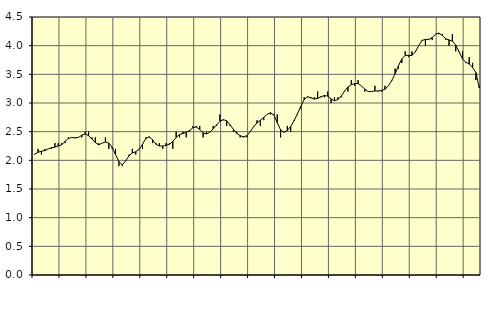
| Category | Piggar | Series 1 |
|---|---|---|
| nan | 2.1 | 2.11 |
| 87.0 | 2.2 | 2.14 |
| 87.0 | 2.1 | 2.16 |
| 87.0 | 2.2 | 2.17 |
| nan | 2.2 | 2.2 |
| 88.0 | 2.2 | 2.22 |
| 88.0 | 2.3 | 2.23 |
| 88.0 | 2.3 | 2.25 |
| nan | 2.3 | 2.27 |
| 89.0 | 2.3 | 2.33 |
| 89.0 | 2.4 | 2.38 |
| 89.0 | 2.4 | 2.4 |
| nan | 2.4 | 2.39 |
| 90.0 | 2.4 | 2.4 |
| 90.0 | 2.4 | 2.44 |
| 90.0 | 2.5 | 2.46 |
| nan | 2.5 | 2.43 |
| 91.0 | 2.4 | 2.37 |
| 91.0 | 2.4 | 2.31 |
| 91.0 | 2.3 | 2.27 |
| nan | 2.3 | 2.3 |
| 92.0 | 2.4 | 2.32 |
| 92.0 | 2.2 | 2.3 |
| 92.0 | 2.2 | 2.23 |
| nan | 2.2 | 2.1 |
| 93.0 | 1.9 | 1.98 |
| 93.0 | 1.9 | 1.92 |
| 93.0 | 2 | 1.99 |
| nan | 2.1 | 2.08 |
| 94.0 | 2.2 | 2.13 |
| 94.0 | 2.1 | 2.15 |
| 94.0 | 2.2 | 2.19 |
| nan | 2.2 | 2.28 |
| 95.0 | 2.4 | 2.38 |
| 95.0 | 2.4 | 2.41 |
| 95.0 | 2.3 | 2.36 |
| nan | 2.3 | 2.28 |
| 96.0 | 2.3 | 2.25 |
| 96.0 | 2.2 | 2.25 |
| 96.0 | 2.3 | 2.26 |
| nan | 2.3 | 2.28 |
| 97.0 | 2.2 | 2.33 |
| 97.0 | 2.5 | 2.4 |
| 97.0 | 2.4 | 2.45 |
| nan | 2.5 | 2.47 |
| 98.0 | 2.4 | 2.49 |
| 98.0 | 2.5 | 2.52 |
| 98.0 | 2.6 | 2.57 |
| nan | 2.6 | 2.58 |
| 99.0 | 2.6 | 2.54 |
| 99.0 | 2.4 | 2.48 |
| 99.0 | 2.5 | 2.46 |
| nan | 2.5 | 2.49 |
| 0.0 | 2.6 | 2.55 |
| 0.0 | 2.6 | 2.62 |
| 0.0 | 2.8 | 2.68 |
| nan | 2.7 | 2.71 |
| 1.0 | 2.6 | 2.69 |
| 1.0 | 2.6 | 2.62 |
| 1.0 | 2.5 | 2.54 |
| nan | 2.5 | 2.47 |
| 2.0 | 2.4 | 2.43 |
| 2.0 | 2.4 | 2.41 |
| 2.0 | 2.4 | 2.43 |
| nan | 2.5 | 2.5 |
| 3.0 | 2.6 | 2.59 |
| 3.0 | 2.7 | 2.65 |
| 3.0 | 2.6 | 2.7 |
| nan | 2.7 | 2.75 |
| 4.0 | 2.8 | 2.8 |
| 4.0 | 2.8 | 2.83 |
| 4.0 | 2.8 | 2.79 |
| nan | 2.8 | 2.66 |
| 5.0 | 2.4 | 2.53 |
| 5.0 | 2.5 | 2.49 |
| 5.0 | 2.6 | 2.52 |
| nan | 2.5 | 2.59 |
| 6.0 | 2.7 | 2.69 |
| 6.0 | 2.8 | 2.81 |
| 6.0 | 2.9 | 2.94 |
| nan | 3.1 | 3.06 |
| 7.0 | 3.1 | 3.11 |
| 7.0 | 3.1 | 3.09 |
| 7.0 | 3.1 | 3.07 |
| nan | 3.2 | 3.08 |
| 8.0 | 3.1 | 3.11 |
| 8.0 | 3.1 | 3.13 |
| 8.0 | 3.2 | 3.12 |
| nan | 3 | 3.07 |
| 9.0 | 3.1 | 3.04 |
| 9.0 | 3.1 | 3.06 |
| 9.0 | 3.1 | 3.12 |
| nan | 3.2 | 3.21 |
| 10.0 | 3.2 | 3.28 |
| 10.0 | 3.4 | 3.32 |
| 10.0 | 3.3 | 3.34 |
| nan | 3.4 | 3.34 |
| 11.0 | 3.3 | 3.3 |
| 11.0 | 3.2 | 3.24 |
| 11.0 | 3.2 | 3.2 |
| nan | 3.2 | 3.2 |
| 12.0 | 3.3 | 3.21 |
| 12.0 | 3.2 | 3.21 |
| 12.0 | 3.2 | 3.22 |
| nan | 3.3 | 3.24 |
| 13.0 | 3.3 | 3.3 |
| 13.0 | 3.4 | 3.39 |
| 13.0 | 3.6 | 3.51 |
| nan | 3.6 | 3.65 |
| 14.0 | 3.7 | 3.77 |
| 14.0 | 3.9 | 3.83 |
| 14.0 | 3.8 | 3.83 |
| nan | 3.9 | 3.83 |
| 15.0 | 3.9 | 3.89 |
| 15.0 | 4 | 4 |
| 15.0 | 4.1 | 4.09 |
| nan | 4 | 4.11 |
| 16.0 | 4.1 | 4.11 |
| 16.0 | 4.1 | 4.14 |
| 16.0 | 4.2 | 4.2 |
| nan | 4.2 | 4.22 |
| 17.0 | 4.2 | 4.18 |
| 17.0 | 4.1 | 4.12 |
| 17.0 | 4 | 4.1 |
| nan | 4.2 | 4.08 |
| 18.0 | 3.9 | 4.01 |
| 18.0 | 3.9 | 3.89 |
| 18.0 | 3.9 | 3.77 |
| nan | 3.7 | 3.71 |
| 19.0 | 3.8 | 3.68 |
| 19.0 | 3.7 | 3.62 |
| 19.0 | 3.4 | 3.53 |
| nan | 3.3 | 3.26 |